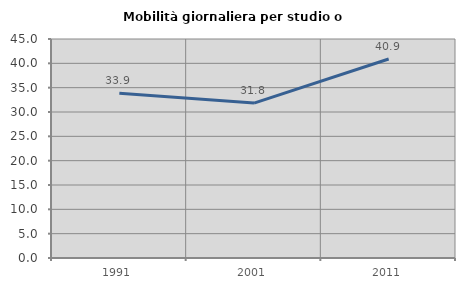
| Category | Mobilità giornaliera per studio o lavoro |
|---|---|
| 1991.0 | 33.852 |
| 2001.0 | 31.83 |
| 2011.0 | 40.9 |